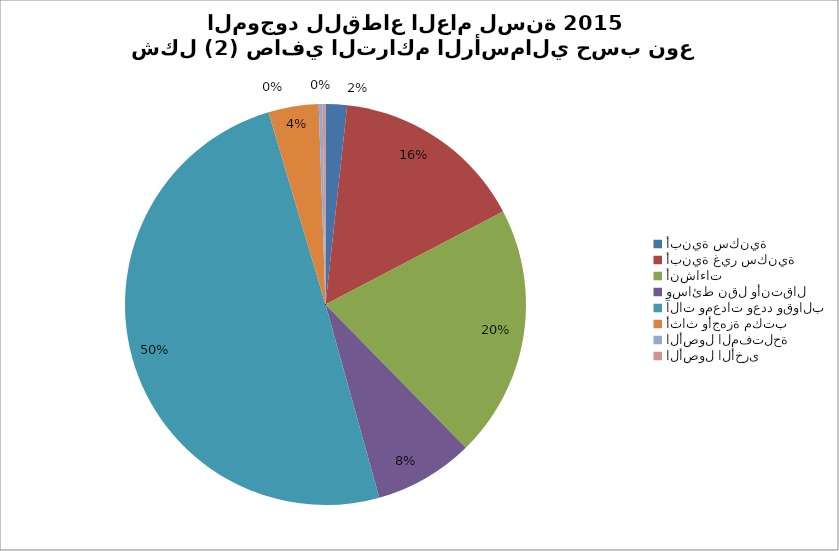
| Category | Series 0 |
|---|---|
| أبنية سكنية | 1870926.952 |
| أبنية غير سكنية | 16884574.252 |
| أنشاءات | 22022682.02 |
| وسائط نقل وأنتقال | 8686811.561 |
| آلات ومعدات وعدد وقوالب | 53859133.652 |
| أثاث وأجهزة مكتب | 4380324.398 |
| الأصول المفتلحة | 332316.365 |
| الأصول الأخرى  | 254863.249 |